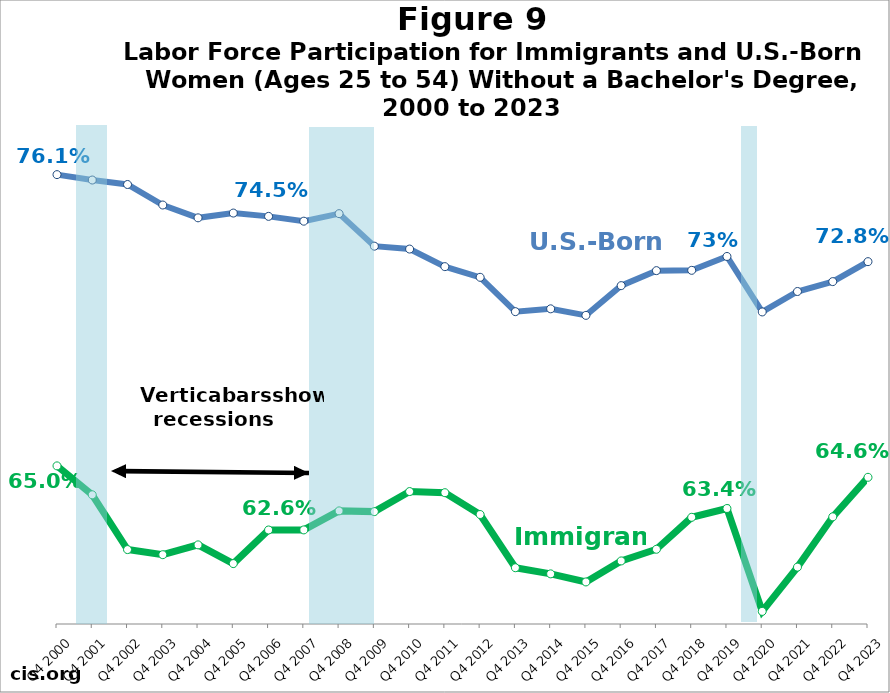
| Category | Native | Immigrant |
|---|---|---|
| Q4 2000 | 0.761 | 0.65 |
| Q4 2001 | 0.759 | 0.639 |
| Q4 2002 | 0.757 | 0.618 |
| Q4 2003 | 0.749 | 0.616 |
| Q4 2004 | 0.744 | 0.62 |
| Q4 2005 | 0.746 | 0.613 |
| Q4 2006 | 0.745 | 0.626 |
| Q4 2007 | 0.743 | 0.626 |
| Q4 2008 | 0.746 | 0.633 |
| Q4 2009 | 0.733 | 0.633 |
| Q4 2010 | 0.732 | 0.64 |
| Q4 2011 | 0.726 | 0.64 |
| Q4 2012 | 0.722 | 0.632 |
| Q4 2013 | 0.709 | 0.611 |
| Q4 2014 | 0.71 | 0.609 |
| Q4 2015 | 0.707 | 0.606 |
| Q4 2016 | 0.718 | 0.614 |
| Q4 2017 | 0.724 | 0.618 |
| Q4 2018 | 0.724 | 0.631 |
| Q4 2019 | 0.73 | 0.634 |
| Q4 2020 | 0.709 | 0.595 |
| Q4 2021 | 0.716 | 0.612 |
| Q4 2022 | 0.72 | 0.631 |
| Q4 2023 | 0.728 | 0.646 |